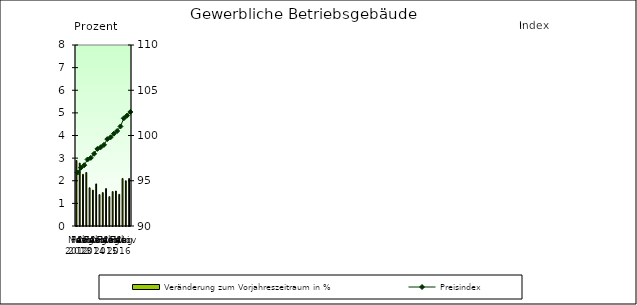
| Category | Veränderung zum Vorjahreszeitraum in % |
|---|---|
| 0 | 2.896 |
| 1 | 2.78 |
| 2 | 2.284 |
| 3 | 2.365 |
| 4 | 1.689 |
| 5 | 1.586 |
| 6 | 1.86 |
| 7 | 1.386 |
| 8 | 1.476 |
| 9 | 1.653 |
| 10 | 1.299 |
| 11 | 1.519 |
| 12 | 1.546 |
| 13 | 1.4 |
| 14 | 2.1 |
| 15 | 2 |
| 16 | 2.1 |